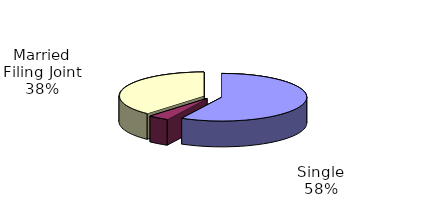
| Category | Series 0 |
|---|---|
| Single | 2258143 |
| Married Filing Separate | 152833 |
| Married Filing Joint | 1496572 |